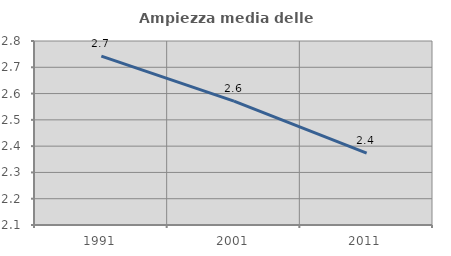
| Category | Ampiezza media delle famiglie |
|---|---|
| 1991.0 | 2.743 |
| 2001.0 | 2.571 |
| 2011.0 | 2.373 |